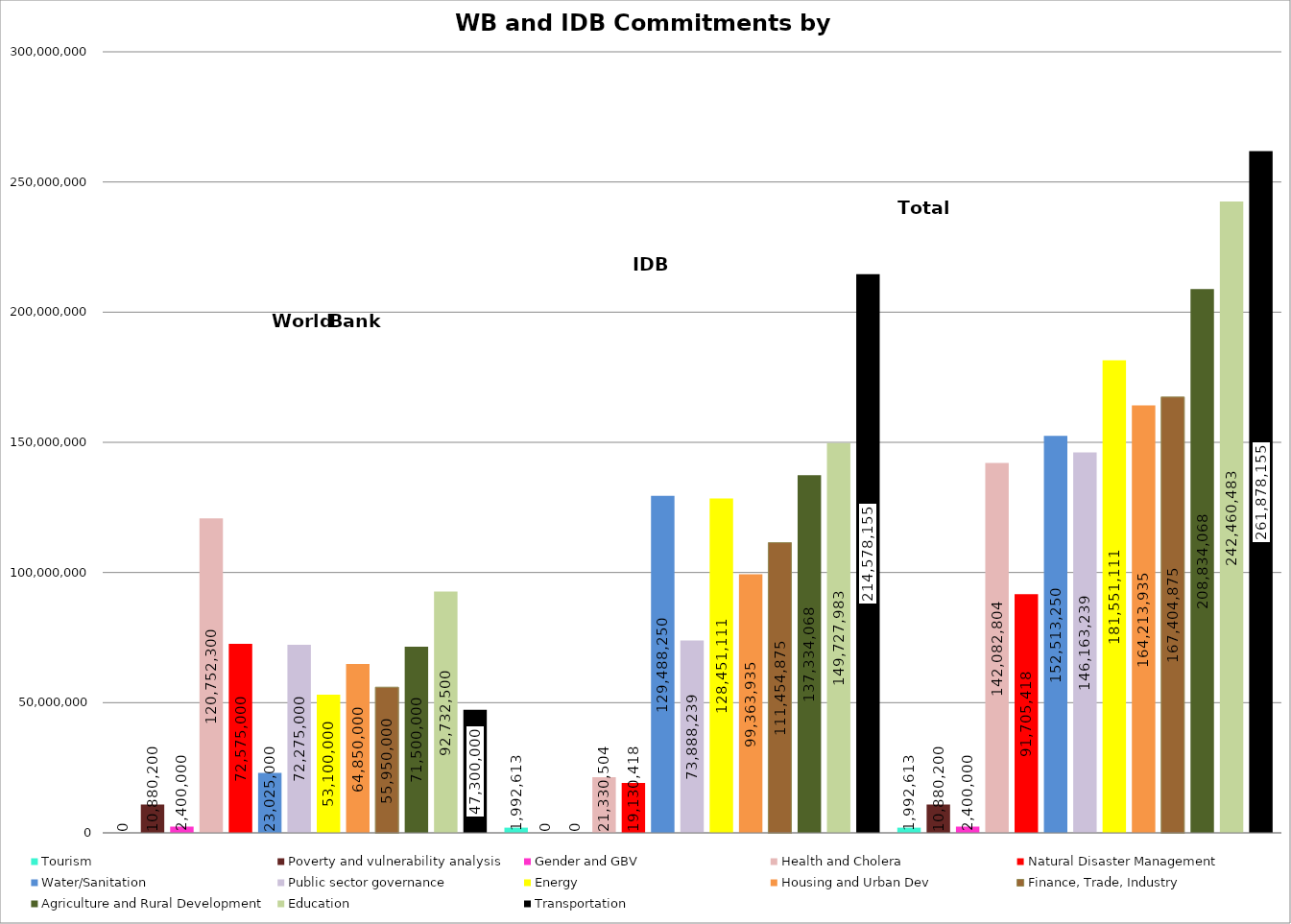
| Category | Tourism | Poverty and vulnerability analysis | Gender and GBV | Health and Cholera | Natural Disaster Management | Water/Sanitation | Public sector governance | Energy | Housing and Urban Dev | Finance, Trade, Industry | Agriculture and Rural Development | Education | Transportation |
|---|---|---|---|---|---|---|---|---|---|---|---|---|---|
|  | 0 | 10880200 | 2400000 | 120752300 | 72575000 | 23025000 | 72275000 | 53100000 | 64850000 | 55950000 | 71500000 | 92732500 | 47300000 |
|  | 1992613 | 0 | 0 | 21330504 | 19130418 | 129488250 | 73888239 | 128451111 | 99363935 | 111454875 | 137334068 | 149727983 | 214578155 |
|  | 1992613 | 10880200 | 2400000 | 142082804 | 91705418 | 152513250 | 146163239 | 181551111 | 164213935 | 167404875 | 208834068 | 242460483 | 261878155 |